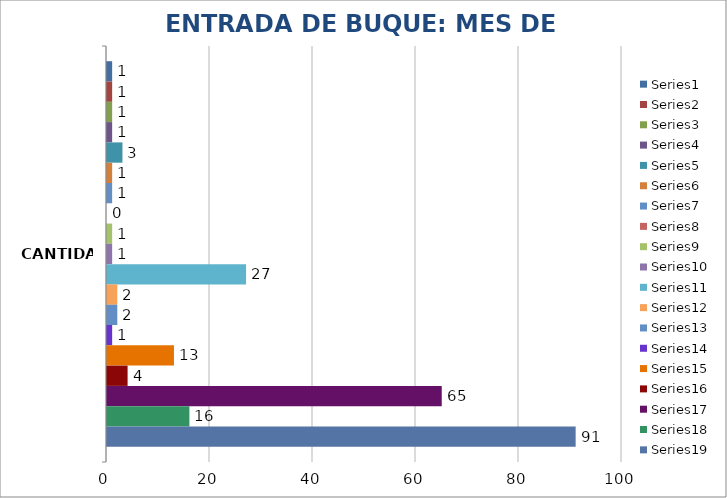
| Category | Series 0 | Series 1 | Series 2 | Series 3 | Series 4 | Series 5 | Series 6 | Series 7 | Series 8 | Series 9 | Series 10 | Series 11 | Series 12 | Series 13 | Series 14 | Series 15 | Series 16 | Series 17 | Series 18 |
|---|---|---|---|---|---|---|---|---|---|---|---|---|---|---|---|---|---|---|---|
| CANTIDAD | 1 | 1 | 1 | 1 | 3 | 1 | 1 | 0 | 1 | 1 | 27 | 2 | 2 | 1 | 13 | 4 | 65 | 16 | 91 |